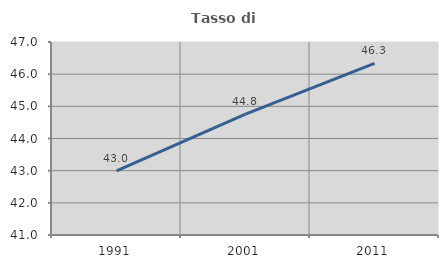
| Category | Tasso di occupazione   |
|---|---|
| 1991.0 | 42.994 |
| 2001.0 | 44.756 |
| 2011.0 | 46.338 |